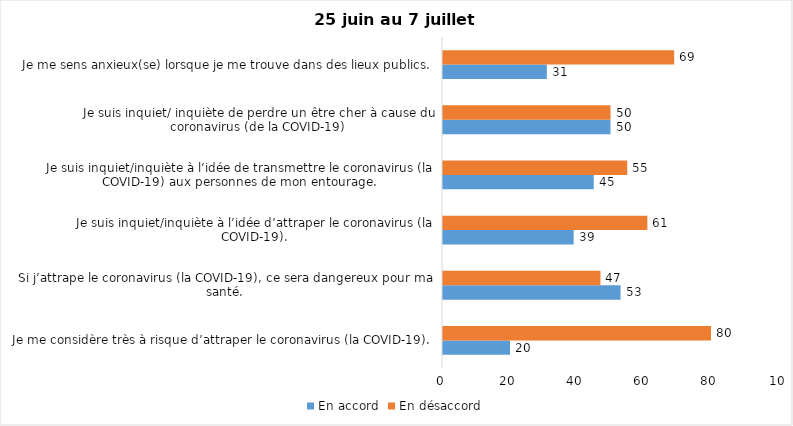
| Category | En accord | En désaccord |
|---|---|---|
| Je me considère très à risque d’attraper le coronavirus (la COVID-19). | 20 | 80 |
| Si j’attrape le coronavirus (la COVID-19), ce sera dangereux pour ma santé. | 53 | 47 |
| Je suis inquiet/inquiète à l’idée d’attraper le coronavirus (la COVID-19). | 39 | 61 |
| Je suis inquiet/inquiète à l’idée de transmettre le coronavirus (la COVID-19) aux personnes de mon entourage. | 45 | 55 |
| Je suis inquiet/ inquiète de perdre un être cher à cause du coronavirus (de la COVID-19) | 50 | 50 |
| Je me sens anxieux(se) lorsque je me trouve dans des lieux publics. | 31 | 69 |